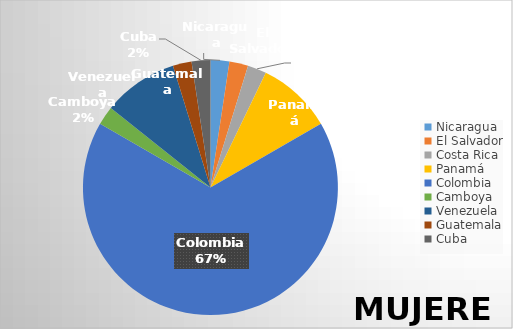
| Category | Series 0 |
|---|---|
| Nicaragua | 1 |
| El Salvador | 1 |
| Costa Rica | 1 |
| Panamá | 4 |
| Colombia  | 28 |
| Camboya | 1 |
| Venezuela | 4 |
| Guatemala | 1 |
| Cuba | 1 |